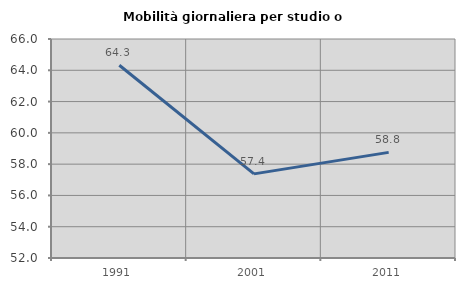
| Category | Mobilità giornaliera per studio o lavoro |
|---|---|
| 1991.0 | 64.324 |
| 2001.0 | 57.377 |
| 2011.0 | 58.753 |